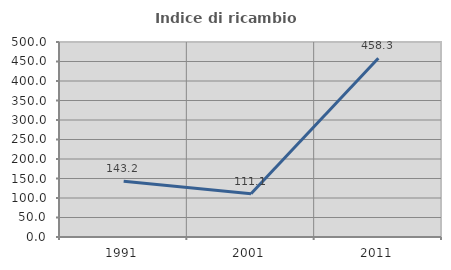
| Category | Indice di ricambio occupazionale  |
|---|---|
| 1991.0 | 143.243 |
| 2001.0 | 111.111 |
| 2011.0 | 458.333 |